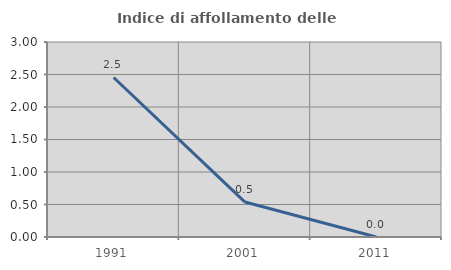
| Category | Indice di affollamento delle abitazioni  |
|---|---|
| 1991.0 | 2.454 |
| 2001.0 | 0.538 |
| 2011.0 | 0 |